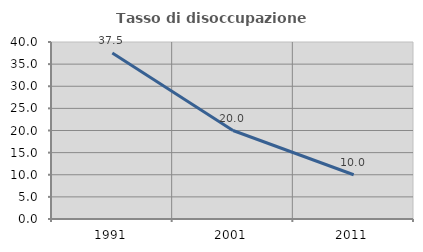
| Category | Tasso di disoccupazione giovanile  |
|---|---|
| 1991.0 | 37.5 |
| 2001.0 | 20 |
| 2011.0 | 10 |